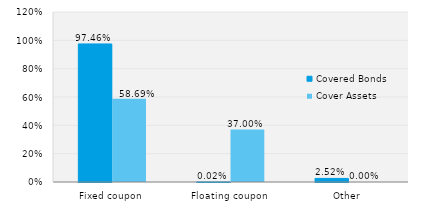
| Category | Covered Bonds | Cover Assets |
|---|---|---|
| Fixed coupon | 0.975 | 0.587 |
| Floating coupon | 0 | 0.37 |
| Other | 0.025 | 0 |